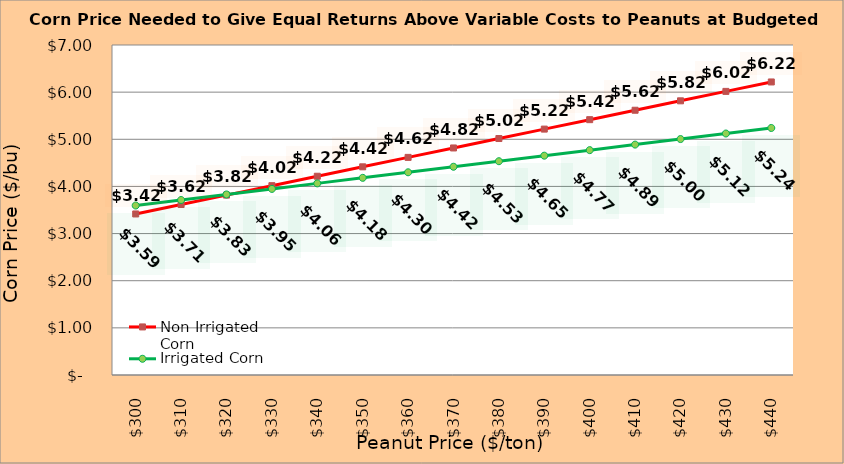
| Category | Non Irrigated Corn | Irrigated Corn |
|---|---|---|
| 299.8936170212766 | 3.416 | 3.595 |
| 309.8936170212766 | 3.616 | 3.712 |
| 319.8936170212766 | 3.816 | 3.83 |
| 329.8936170212766 | 4.016 | 3.947 |
| 339.8936170212766 | 4.216 | 4.065 |
| 349.8936170212766 | 4.416 | 4.182 |
| 359.8936170212766 | 4.616 | 4.3 |
| 369.8936170212766 | 4.816 | 4.417 |
| 379.8936170212766 | 5.016 | 4.535 |
| 389.8936170212766 | 5.216 | 4.652 |
| 399.8936170212766 | 5.416 | 4.77 |
| 409.8936170212766 | 5.616 | 4.887 |
| 419.8936170212766 | 5.816 | 5.005 |
| 429.8936170212766 | 6.016 | 5.122 |
| 439.8936170212766 | 6.216 | 5.24 |